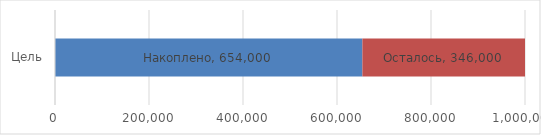
| Category | Накоплено | Осталось |
|---|---|---|
| Цель | 654000 | 346000 |